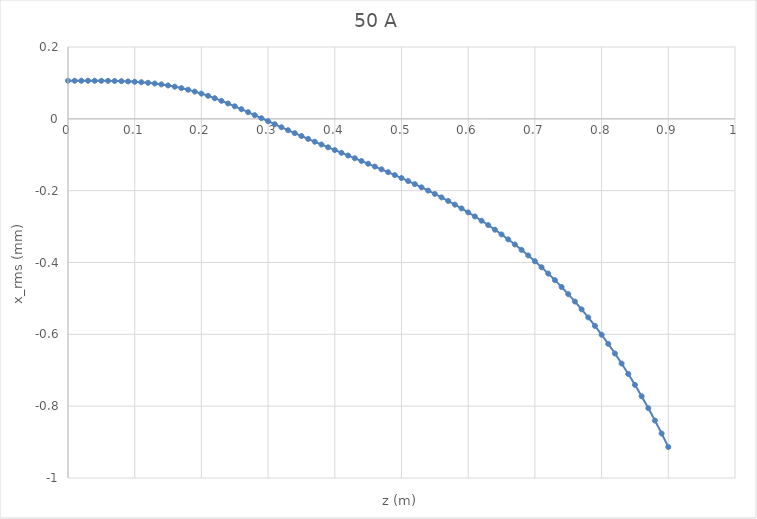
| Category | Series 0 |
|---|---|
| 0.0 | 0.106 |
| 0.01 | 0.106 |
| 0.02 | 0.106 |
| 0.03 | 0.106 |
| 0.04 | 0.106 |
| 0.05 | 0.106 |
| 0.06 | 0.106 |
| 0.07 | 0.105 |
| 0.08 | 0.105 |
| 0.09 | 0.104 |
| 0.1 | 0.103 |
| 0.11 | 0.102 |
| 0.12 | 0.1 |
| 0.13 | 0.098 |
| 0.14 | 0.096 |
| 0.15 | 0.093 |
| 0.16 | 0.09 |
| 0.17 | 0.086 |
| 0.18 | 0.081 |
| 0.19 | 0.076 |
| 0.2 | 0.07 |
| 0.21 | 0.064 |
| 0.22 | 0.057 |
| 0.23 | 0.05 |
| 0.24 | 0.043 |
| 0.25 | 0.035 |
| 0.26 | 0.027 |
| 0.27 | 0.019 |
| 0.28 | 0.01 |
| 0.29 | 0.002 |
| 0.3 | -0.007 |
| 0.31 | -0.015 |
| 0.32 | -0.023 |
| 0.33 | -0.032 |
| 0.34 | -0.04 |
| 0.35 | -0.048 |
| 0.36 | -0.056 |
| 0.37 | -0.064 |
| 0.38 | -0.072 |
| 0.39 | -0.079 |
| 0.4 | -0.087 |
| 0.41 | -0.095 |
| 0.42 | -0.102 |
| 0.43 | -0.11 |
| 0.44 | -0.117 |
| 0.45 | -0.125 |
| 0.46 | -0.133 |
| 0.47 | -0.141 |
| 0.48 | -0.149 |
| 0.49 | -0.157 |
| 0.5 | -0.165 |
| 0.51 | -0.173 |
| 0.52 | -0.182 |
| 0.53 | -0.191 |
| 0.54 | -0.2 |
| 0.55 | -0.209 |
| 0.56 | -0.219 |
| 0.57 | -0.229 |
| 0.58 | -0.239 |
| 0.59 | -0.249 |
| 0.6 | -0.26 |
| 0.61 | -0.272 |
| 0.62 | -0.284 |
| 0.63 | -0.296 |
| 0.64 | -0.309 |
| 0.65 | -0.322 |
| 0.66 | -0.336 |
| 0.67 | -0.35 |
| 0.68 | -0.365 |
| 0.69 | -0.38 |
| 0.7 | -0.396 |
| 0.71 | -0.413 |
| 0.72 | -0.431 |
| 0.73 | -0.449 |
| 0.74 | -0.468 |
| 0.75 | -0.488 |
| 0.76 | -0.509 |
| 0.77 | -0.53 |
| 0.78 | -0.553 |
| 0.79 | -0.576 |
| 0.8 | -0.601 |
| 0.81 | -0.627 |
| 0.82 | -0.653 |
| 0.83 | -0.681 |
| 0.84 | -0.71 |
| 0.85 | -0.741 |
| 0.86 | -0.772 |
| 0.87 | -0.806 |
| 0.88 | -0.84 |
| 0.89 | -0.876 |
| 0.9 | -0.914 |